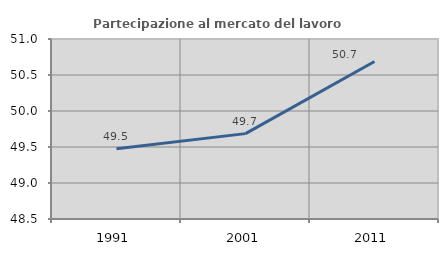
| Category | Partecipazione al mercato del lavoro  femminile |
|---|---|
| 1991.0 | 49.474 |
| 2001.0 | 49.686 |
| 2011.0 | 50.688 |